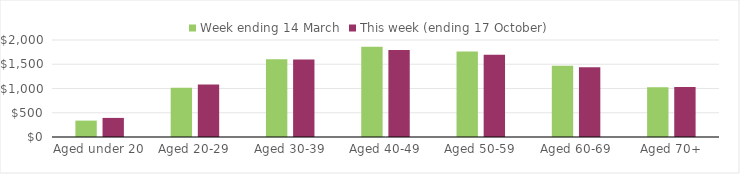
| Category | Week ending 14 March | This week (ending 17 October) |
|---|---|---|
| Aged under 20 | 338.02 | 393.77 |
| Aged 20-29 | 1015.61 | 1080.65 |
| Aged 30-39 | 1600.75 | 1598.43 |
| Aged 40-49 | 1860.07 | 1793.95 |
| Aged 50-59 | 1761.77 | 1696.01 |
| Aged 60-69 | 1471.07 | 1437 |
| Aged 70+ | 1023.56 | 1030.09 |